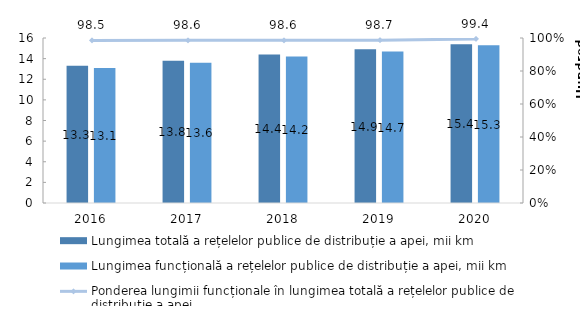
| Category | Lungimea totală a rețelelor publice de distribuție a apei, mii km | Lungimea funcțională a rețelelor publice de distribuție a apei, mii km |
|---|---|---|
| 2016.0 | 13.3 | 13.1 |
| 2017.0 | 13.8 | 13.6 |
| 2018.0 | 14.4 | 14.2 |
| 2019.0 | 14.9 | 14.7 |
| 2020.0 | 15.4 | 15.3 |